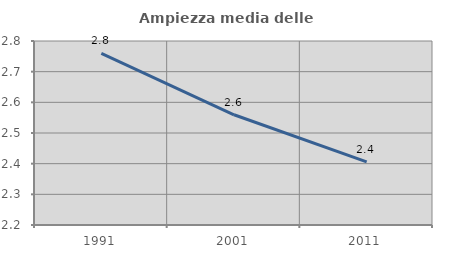
| Category | Ampiezza media delle famiglie |
|---|---|
| 1991.0 | 2.759 |
| 2001.0 | 2.559 |
| 2011.0 | 2.406 |